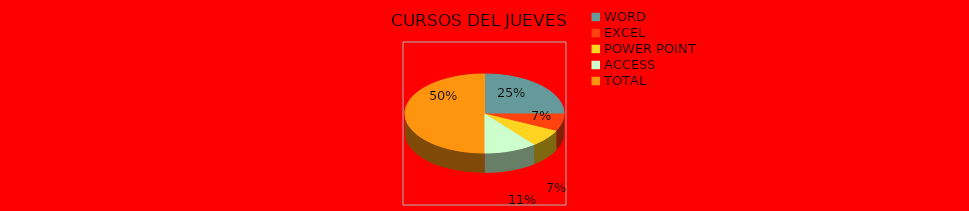
| Category | Series 0 |
|---|---|
| WORD | 7 |
| EXCEL | 2 |
| POWER POINT | 2 |
| ACCESS | 3 |
| TOTAL | 14 |